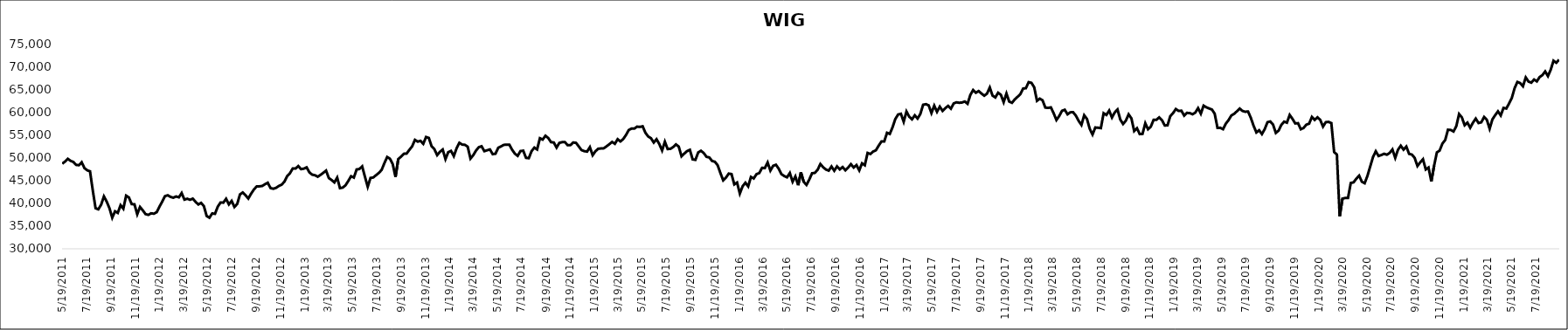
| Category | WIG |
|---|---|
| 5/19/11 | 48747.55 |
| 5/26/11 | 49215.53 |
| 6/2/11 | 49824.93 |
| 6/9/11 | 49378.82 |
| 6/16/11 | 49129.21 |
| 6/23/11 | 48485.26 |
| 6/30/11 | 48414.36 |
| 7/7/11 | 49057.05 |
| 7/14/11 | 47768.38 |
| 7/21/11 | 47291.31 |
| 7/28/11 | 47071.4 |
| 8/4/11 | 42828.22 |
| 8/11/11 | 38934.71 |
| 8/18/11 | 38697.56 |
| 8/25/11 | 39715.27 |
| 9/1/11 | 41553.09 |
| 9/8/11 | 40405.17 |
| 9/15/11 | 38945 |
| 9/22/11 | 36851.2 |
| 9/29/11 | 38264.32 |
| 10/6/11 | 37915.03 |
| 10/13/11 | 39608.13 |
| 10/20/11 | 38835.92 |
| 10/27/11 | 41708.88 |
| 11/3/11 | 41313.92 |
| 11/10/11 | 39853.18 |
| 11/17/11 | 39797.19 |
| 11/24/11 | 37607.27 |
| 12/1/11 | 39215.21 |
| 12/8/11 | 38474.28 |
| 12/15/11 | 37637.47 |
| 12/22/11 | 37478.7 |
| 12/29/11 | 37814.52 |
| 1/5/12 | 37739.39 |
| 1/12/12 | 38062.87 |
| 1/19/12 | 39288.13 |
| 1/26/12 | 40392.48 |
| 2/2/12 | 41602.24 |
| 2/9/12 | 41792.46 |
| 2/16/12 | 41430.3 |
| 2/23/12 | 41258.14 |
| 3/1/12 | 41533.87 |
| 3/8/12 | 41337.97 |
| 3/15/12 | 42281.33 |
| 3/22/12 | 40834.43 |
| 3/29/12 | 41028.06 |
| 4/5/12 | 40802.41 |
| 4/12/12 | 41053.82 |
| 4/19/12 | 40354.53 |
| 4/26/12 | 39761.78 |
| 5/3/12 | 40114.73 |
| 5/10/12 | 39404.16 |
| 5/17/12 | 37228.88 |
| 5/24/12 | 36852.75 |
| 5/31/12 | 37793.58 |
| 6/7/12 | 37707.25 |
| 6/14/12 | 39286.64 |
| 6/21/12 | 40207.61 |
| 6/28/12 | 40165.34 |
| 7/5/12 | 41013.96 |
| 7/12/12 | 39778.1 |
| 7/19/12 | 40545.64 |
| 7/26/12 | 39213.05 |
| 8/2/12 | 39876.95 |
| 8/9/12 | 41976.63 |
| 8/16/12 | 42408.41 |
| 8/23/12 | 41795.63 |
| 8/30/12 | 41077.44 |
| 9/6/12 | 42134.93 |
| 9/13/12 | 43047.41 |
| 9/20/12 | 43737.02 |
| 9/27/12 | 43763.3 |
| 10/4/12 | 43840.23 |
| 10/11/12 | 44224.67 |
| 10/18/12 | 44550.12 |
| 10/25/12 | 43374.6 |
| 11/1/12 | 43232.44 |
| 11/8/12 | 43429.42 |
| 11/15/12 | 43845.94 |
| 11/22/12 | 44121.53 |
| 11/29/12 | 44787.84 |
| 12/6/12 | 46019.97 |
| 12/13/12 | 46653.84 |
| 12/20/12 | 47701.82 |
| 12/27/12 | 47673.03 |
| 1/3/13 | 48222.72 |
| 1/10/13 | 47546.91 |
| 1/17/13 | 47661.37 |
| 1/24/13 | 47942.04 |
| 1/31/13 | 46840.15 |
| 2/7/13 | 46329.66 |
| 2/14/13 | 46211.54 |
| 2/21/13 | 45879.9 |
| 2/28/13 | 46280.36 |
| 3/7/13 | 46745.26 |
| 3/14/13 | 47223.68 |
| 3/21/13 | 45580.47 |
| 3/28/13 | 45147.57 |
| 4/4/13 | 44623.89 |
| 4/11/13 | 45688.48 |
| 4/18/13 | 43364.7 |
| 4/25/13 | 43482.18 |
| 5/2/13 | 43991.51 |
| 5/9/13 | 44943.16 |
| 5/16/13 | 45992.03 |
| 5/23/13 | 45687.76 |
| 5/30/13 | 47476.64 |
| 6/6/13 | 47573.66 |
| 6/13/13 | 48152.82 |
| 6/20/13 | 45870 |
| 6/27/13 | 43667.37 |
| 7/4/13 | 45613.75 |
| 7/11/13 | 45712.72 |
| 7/18/13 | 46221.23 |
| 7/25/13 | 46713.02 |
| 8/1/13 | 47370.81 |
| 8/8/13 | 48862.88 |
| 8/15/13 | 50223.95 |
| 8/22/13 | 49846.48 |
| 8/29/13 | 48676.45 |
| 9/5/13 | 45830.66 |
| 9/12/13 | 49771.55 |
| 9/19/13 | 50300.53 |
| 9/26/13 | 50936.34 |
| 10/3/13 | 50982.03 |
| 10/10/13 | 51806.83 |
| 10/17/13 | 52573.59 |
| 10/24/13 | 53994.46 |
| 10/31/13 | 53607.86 |
| 11/7/13 | 53785.07 |
| 11/14/13 | 53127.16 |
| 11/21/13 | 54621.21 |
| 11/28/13 | 54420.19 |
| 12/5/13 | 52597.13 |
| 12/12/13 | 51947.96 |
| 12/19/13 | 50631.75 |
| 12/26/13 | 51362.3 |
| 1/2/14 | 51865.89 |
| 1/9/14 | 49753.03 |
| 1/16/14 | 51288.7 |
| 1/23/14 | 51569.21 |
| 1/30/14 | 50417.17 |
| 2/6/14 | 52138.87 |
| 2/13/14 | 53349.65 |
| 2/20/14 | 52967.02 |
| 2/27/14 | 52906.04 |
| 3/6/14 | 52487.84 |
| 3/13/14 | 49878.65 |
| 3/20/14 | 50627.71 |
| 3/27/14 | 51642.99 |
| 4/3/14 | 52376.18 |
| 4/10/14 | 52580.73 |
| 4/17/14 | 51510.98 |
| 4/24/14 | 51705.76 |
| 5/1/14 | 51892.77 |
| 5/8/14 | 50851.25 |
| 5/15/14 | 50944.5 |
| 5/22/14 | 52244.13 |
| 5/29/14 | 52553.48 |
| 6/5/14 | 52901.29 |
| 6/12/14 | 52927.91 |
| 6/19/14 | 52937.45 |
| 6/26/14 | 51815.43 |
| 7/3/14 | 50951.73 |
| 7/10/14 | 50474.36 |
| 7/17/14 | 51527.37 |
| 7/24/14 | 51613.47 |
| 7/31/14 | 50037.12 |
| 8/7/14 | 49958.67 |
| 8/14/14 | 51512.57 |
| 8/21/14 | 52294.93 |
| 8/28/14 | 51882.01 |
| 9/4/14 | 54358.49 |
| 9/11/14 | 54065.27 |
| 9/18/14 | 54906.1 |
| 9/25/14 | 54411.77 |
| 10/2/14 | 53498.77 |
| 10/9/14 | 53416.03 |
| 10/16/14 | 52297.79 |
| 10/23/14 | 53335.43 |
| 10/30/14 | 53492 |
| 11/6/14 | 53512.14 |
| 11/13/14 | 52816.35 |
| 11/20/14 | 52848.54 |
| 11/27/14 | 53415.63 |
| 12/4/14 | 53346.86 |
| 12/11/14 | 52550.03 |
| 12/18/14 | 51739.04 |
| 12/25/14 | 51511.68 |
| 1/1/15 | 51416.08 |
| 1/8/15 | 52391 |
| 1/15/15 | 50616.63 |
| 1/22/15 | 51484.81 |
| 1/29/15 | 52040.24 |
| 2/5/15 | 52107.26 |
| 2/12/15 | 52139.81 |
| 2/19/15 | 52572.95 |
| 2/26/15 | 53042.6 |
| 3/5/15 | 53546.4 |
| 3/12/15 | 53136.13 |
| 3/19/15 | 54148.48 |
| 3/26/15 | 53649.9 |
| 4/2/15 | 54179.04 |
| 4/9/15 | 55063.85 |
| 4/16/15 | 56165.1 |
| 4/23/15 | 56492.95 |
| 4/30/15 | 56477.69 |
| 5/7/15 | 56911.34 |
| 5/14/15 | 56845.83 |
| 5/21/15 | 56990.6 |
| 5/28/15 | 55556.13 |
| 6/4/15 | 54749.74 |
| 6/11/15 | 54357.69 |
| 6/18/15 | 53408.53 |
| 6/25/15 | 54141.2 |
| 7/2/15 | 53074.71 |
| 7/9/15 | 51658.71 |
| 7/16/15 | 53588.24 |
| 7/23/15 | 51986.22 |
| 7/30/15 | 52011.81 |
| 8/6/15 | 52418.07 |
| 8/13/15 | 52995.96 |
| 8/20/15 | 52508.32 |
| 8/27/15 | 50366.09 |
| 9/3/15 | 50977.06 |
| 9/10/15 | 51527.08 |
| 9/17/15 | 51801.58 |
| 9/24/15 | 49701.31 |
| 10/1/15 | 49593.95 |
| 10/8/15 | 51222.77 |
| 10/15/15 | 51599.62 |
| 10/22/15 | 51094.29 |
| 10/29/15 | 50262.68 |
| 11/5/15 | 50125.85 |
| 11/12/15 | 49358.2 |
| 11/19/15 | 49177.74 |
| 11/26/15 | 48418.14 |
| 12/3/15 | 46693.09 |
| 12/10/15 | 45093.65 |
| 12/17/15 | 45684.05 |
| 12/24/15 | 46564.08 |
| 12/31/15 | 46467.38 |
| 1/7/16 | 44195.91 |
| 1/14/16 | 44596.08 |
| 1/21/16 | 42180.3 |
| 1/28/16 | 43778.96 |
| 2/4/16 | 44557.64 |
| 2/11/16 | 43741.96 |
| 2/18/16 | 45834.88 |
| 2/25/16 | 45497.77 |
| 3/3/16 | 46448.27 |
| 3/10/16 | 46686.74 |
| 3/17/16 | 47833.39 |
| 3/24/16 | 47778.01 |
| 3/31/16 | 49017.35 |
| 4/7/16 | 47231.36 |
| 4/14/16 | 48285.21 |
| 4/21/16 | 48514.39 |
| 4/28/16 | 47643.7 |
| 5/5/16 | 46430.16 |
| 5/12/16 | 46022.02 |
| 5/19/16 | 45751.68 |
| 5/26/16 | 46695.37 |
| 6/2/16 | 44772.72 |
| 6/9/16 | 45940.12 |
| 6/16/16 | 44007.81 |
| 6/23/16 | 46826.85 |
| 6/30/16 | 44748.53 |
| 7/7/16 | 44077.16 |
| 7/14/16 | 45246.26 |
| 7/21/16 | 46639.17 |
| 7/28/16 | 46718.98 |
| 8/4/16 | 47407.09 |
| 8/11/16 | 48675.96 |
| 8/18/16 | 47967.07 |
| 8/25/16 | 47464.07 |
| 9/1/16 | 47221.32 |
| 9/8/16 | 48129.15 |
| 9/15/16 | 47198.39 |
| 9/22/16 | 48154.88 |
| 9/29/16 | 47494.62 |
| 10/6/16 | 48014.44 |
| 10/13/16 | 47303.15 |
| 10/20/16 | 47894.17 |
| 10/27/16 | 48651.28 |
| 11/3/16 | 47899.61 |
| 11/10/16 | 48447.59 |
| 11/17/16 | 47274.21 |
| 11/24/16 | 48824.83 |
| 12/1/16 | 48404.21 |
| 12/8/16 | 51123.43 |
| 12/15/16 | 50881.35 |
| 12/22/16 | 51423.71 |
| 12/29/16 | 51703.91 |
| 1/5/17 | 52721.67 |
| 1/12/17 | 53650.94 |
| 1/19/17 | 53654.99 |
| 1/26/17 | 55560.23 |
| 2/2/17 | 55303.11 |
| 2/9/17 | 56785.52 |
| 2/16/17 | 58610.28 |
| 2/23/17 | 59583.89 |
| 3/2/17 | 59743.64 |
| 3/9/17 | 57986.6 |
| 3/16/17 | 60247.18 |
| 3/23/17 | 59093.68 |
| 3/30/17 | 58527.2 |
| 4/6/17 | 59406.36 |
| 4/13/17 | 58695.36 |
| 4/20/17 | 59700.07 |
| 4/27/17 | 61731.8 |
| 5/4/17 | 61862.8 |
| 5/11/17 | 61598.78 |
| 5/18/17 | 59901.12 |
| 5/25/17 | 61536.22 |
| 6/1/17 | 60181.96 |
| 6/8/17 | 61312.68 |
| 6/15/17 | 60381.07 |
| 6/22/17 | 60987.33 |
| 6/29/17 | 61475.96 |
| 7/6/17 | 60869.83 |
| 7/13/17 | 62018.68 |
| 7/20/17 | 62269.72 |
| 7/27/17 | 62171.7 |
| 8/3/17 | 62231.08 |
| 8/10/17 | 62451.57 |
| 8/17/17 | 61949.4 |
| 8/24/17 | 63886.54 |
| 8/31/17 | 64973.76 |
| 9/7/17 | 64381.87 |
| 9/14/17 | 64748.47 |
| 9/21/17 | 64209.19 |
| 9/28/17 | 63729.77 |
| 10/5/17 | 64185.71 |
| 10/12/17 | 65529.1 |
| 10/19/17 | 63745 |
| 10/26/17 | 63342.71 |
| 11/2/17 | 64375.83 |
| 11/9/17 | 63923.62 |
| 11/16/17 | 62299.29 |
| 11/23/17 | 64207.77 |
| 11/30/17 | 62440.31 |
| 12/7/17 | 62164.65 |
| 12/14/17 | 62916.39 |
| 12/21/17 | 63477.25 |
| 12/28/17 | 64053.47 |
| 1/4/18 | 65297.96 |
| 1/11/18 | 65379.88 |
| 1/18/18 | 66709.12 |
| 1/25/18 | 66561.79 |
| 2/1/18 | 65585.79 |
| 2/8/18 | 62604.89 |
| 2/15/18 | 63078.16 |
| 2/22/18 | 62717.27 |
| 3/1/18 | 61116.96 |
| 3/8/18 | 61036.99 |
| 3/15/18 | 61156.91 |
| 3/22/18 | 59862.55 |
| 3/29/18 | 58377.42 |
| 4/5/18 | 59244.04 |
| 4/12/18 | 60393.23 |
| 4/19/18 | 60629.81 |
| 4/26/18 | 59628.04 |
| 5/3/18 | 60066.46 |
| 5/10/18 | 60091.26 |
| 5/17/18 | 59337.27 |
| 5/24/18 | 58189.49 |
| 5/31/18 | 57282.73 |
| 6/7/18 | 59412.76 |
| 6/14/18 | 58603.93 |
| 6/21/18 | 56425.25 |
| 6/28/18 | 55169.77 |
| 7/5/18 | 56719.88 |
| 7/12/18 | 56671.44 |
| 7/19/18 | 56585.5 |
| 7/26/18 | 59871.2 |
| 8/2/18 | 59484.35 |
| 8/9/18 | 60455.75 |
| 8/16/18 | 58921.44 |
| 8/23/18 | 60044.45 |
| 8/30/18 | 60690.32 |
| 9/6/18 | 58469.6 |
| 9/13/18 | 57493.38 |
| 9/20/18 | 58231.57 |
| 9/27/18 | 59616.27 |
| 10/4/18 | 58736.08 |
| 10/11/18 | 55941.06 |
| 10/18/18 | 56560.93 |
| 10/25/18 | 55271.63 |
| 11/1/18 | 55312.71 |
| 11/8/18 | 57655.73 |
| 11/15/18 | 56329.01 |
| 11/22/18 | 56932.62 |
| 11/29/18 | 58412.94 |
| 12/6/18 | 58409.09 |
| 12/13/18 | 58952.55 |
| 12/20/18 | 58349.03 |
| 12/27/18 | 57183.28 |
| 1/3/19 | 57192.42 |
| 1/10/19 | 59219.23 |
| 1/17/19 | 59894.9 |
| 1/24/19 | 60791.02 |
| 1/31/19 | 60367.42 |
| 2/7/19 | 60422.38 |
| 2/14/19 | 59348.4 |
| 2/21/19 | 59938.07 |
| 2/28/19 | 59903.7 |
| 3/7/19 | 59638.3 |
| 3/14/19 | 60002.72 |
| 3/21/19 | 60976.51 |
| 3/28/19 | 59752.66 |
| 4/4/19 | 61533.27 |
| 4/11/19 | 61168.92 |
| 4/18/19 | 60910.11 |
| 4/25/19 | 60680.62 |
| 5/2/19 | 59744.3 |
| 5/9/19 | 56637.25 |
| 5/16/19 | 56664.5 |
| 5/23/19 | 56351.13 |
| 5/30/19 | 57566.83 |
| 6/6/19 | 58360.5 |
| 6/13/19 | 59374.38 |
| 6/20/19 | 59738.56 |
| 6/27/19 | 60293.37 |
| 7/4/19 | 60888.98 |
| 7/11/19 | 60362.11 |
| 7/18/19 | 60192.6 |
| 7/25/19 | 60249.72 |
| 8/1/19 | 58863.73 |
| 8/8/19 | 57102.69 |
| 8/15/19 | 55634.7 |
| 8/22/19 | 56118.92 |
| 8/29/19 | 55273.05 |
| 9/5/19 | 56358.3 |
| 9/12/19 | 57886.6 |
| 9/19/19 | 58053.03 |
| 9/26/19 | 57377.87 |
| 10/3/19 | 55523.06 |
| 10/10/19 | 56034.97 |
| 10/17/19 | 57297.12 |
| 10/24/19 | 58012.97 |
| 10/31/19 | 57783.02 |
| 11/7/19 | 59492.22 |
| 11/14/19 | 58622.1 |
| 11/21/19 | 57618.54 |
| 11/28/19 | 57669.94 |
| 12/5/19 | 56338.75 |
| 12/12/19 | 56621.06 |
| 12/19/19 | 57346.95 |
| 12/26/19 | 57569.71 |
| 1/2/20 | 59048.28 |
| 1/9/20 | 58397.17 |
| 1/16/20 | 58962.37 |
| 1/23/20 | 58401.85 |
| 1/30/20 | 56923.36 |
| 2/6/20 | 57900.04 |
| 2/13/20 | 57960.23 |
| 2/20/20 | 57693.12 |
| 2/27/20 | 51318.69 |
| 3/5/20 | 50753.91 |
| 3/12/20 | 37164.02 |
| 3/19/20 | 41041.92 |
| 3/26/20 | 41202.98 |
| 4/2/20 | 41219.51 |
| 4/9/20 | 44499.23 |
| 4/16/20 | 44645.12 |
| 4/23/20 | 45450.43 |
| 4/30/20 | 46117 |
| 5/7/20 | 44769.05 |
| 5/14/20 | 44450.71 |
| 5/21/20 | 46073.39 |
| 5/28/20 | 48144.34 |
| 6/4/20 | 50202.54 |
| 6/11/20 | 51486.94 |
| 6/18/20 | 50445.13 |
| 6/25/20 | 50658.89 |
| 7/2/20 | 50937.18 |
| 7/9/20 | 50726.22 |
| 7/16/20 | 51121.23 |
| 7/23/20 | 51890.42 |
| 7/30/20 | 50024.63 |
| 8/6/20 | 51816.87 |
| 8/13/20 | 52706.25 |
| 8/20/20 | 51842.65 |
| 8/27/20 | 52528.67 |
| 9/3/20 | 50915.67 |
| 9/10/20 | 50757.07 |
| 9/17/20 | 50035.54 |
| 9/24/20 | 48241.11 |
| 10/1/20 | 49035.41 |
| 10/8/20 | 49727.34 |
| 10/15/20 | 47482 |
| 10/22/20 | 47910.38 |
| 10/29/20 | 44840.6 |
| 11/5/20 | 48295.31 |
| 11/12/20 | 51229.23 |
| 11/19/20 | 51651.4 |
| 11/26/20 | 53187.31 |
| 12/3/20 | 53967.82 |
| 12/10/20 | 56230.4 |
| 12/17/20 | 56176.07 |
| 12/24/20 | 55843.46 |
| 12/31/20 | 57025.84 |
| 1/7/21 | 59687.54 |
| 1/14/21 | 58945.17 |
| 1/21/21 | 57226.74 |
| 1/28/21 | 57797.95 |
| 2/4/21 | 56669.86 |
| 2/11/21 | 57790.5 |
| 2/18/21 | 58684.46 |
| 2/25/21 | 57706.4 |
| 3/4/21 | 57869.71 |
| 3/11/21 | 59028.6 |
| 3/18/21 | 58405.96 |
| 3/25/21 | 56448.66 |
| 4/1/21 | 58512.71 |
| 4/8/21 | 59435.58 |
| 4/15/21 | 60279.93 |
| 4/22/21 | 59376.35 |
| 4/29/21 | 61043.33 |
| 5/6/21 | 60898.92 |
| 5/13/21 | 62004.52 |
| 5/20/21 | 63262.41 |
| 5/27/21 | 65400.51 |
| 6/3/21 | 66757.97 |
| 6/10/21 | 66507.19 |
| 6/17/21 | 65806.48 |
| 6/24/21 | 67745.39 |
| 7/1/21 | 66836.25 |
| 7/8/21 | 66598.05 |
| 7/15/21 | 67292.59 |
| 7/22/21 | 66882.41 |
| 7/29/21 | 67833.05 |
| 8/5/21 | 68256.77 |
| 8/12/21 | 69076.8 |
| 8/19/21 | 68035.61 |
| 8/26/21 | 69454.99 |
| 9/2/21 | 71431.16 |
| 9/9/21 | 70980.21 |
| 9/16/21 | 71674.66 |